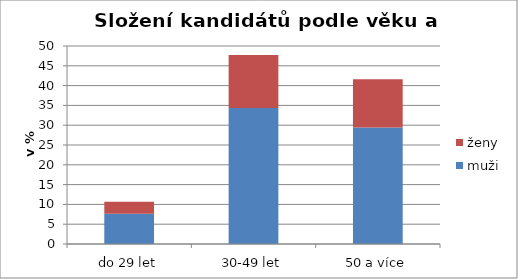
| Category | muži | ženy |
|---|---|---|
| do 29 let | 7.63 | 3.02 |
| 30-49 let | 34.34 | 13.41 |
| 50 a více | 29.4 | 12.2 |